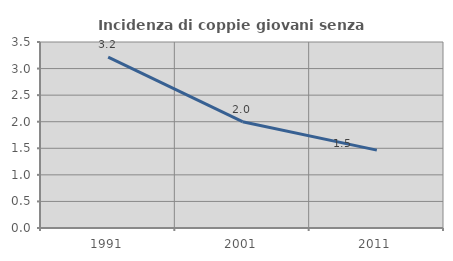
| Category | Incidenza di coppie giovani senza figli |
|---|---|
| 1991.0 | 3.215 |
| 2001.0 | 2 |
| 2011.0 | 1.465 |